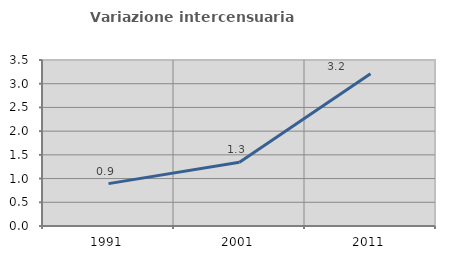
| Category | Variazione intercensuaria annua |
|---|---|
| 1991.0 | 0.894 |
| 2001.0 | 1.346 |
| 2011.0 | 3.209 |